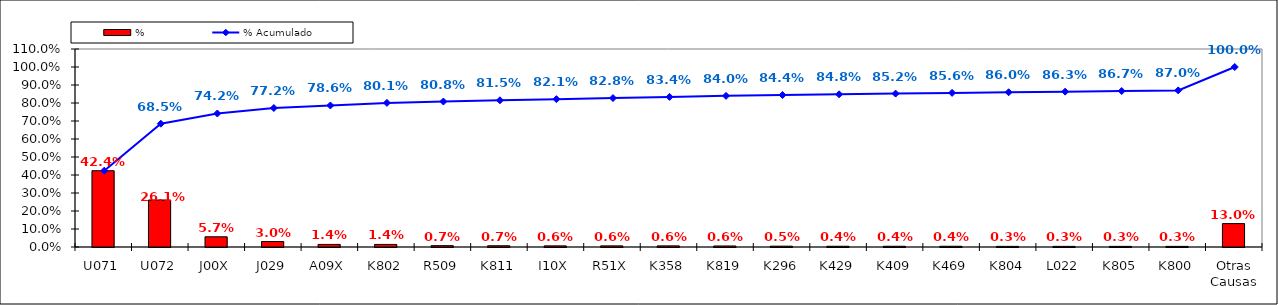
| Category | % |
|---|---|
| U071 | 0.424 |
| U072 | 0.261 |
| J00X | 0.057 |
| J029 | 0.03 |
| A09X | 0.014 |
| K802 | 0.014 |
| R509 | 0.007 |
| K811 | 0.007 |
| I10X | 0.006 |
| R51X | 0.006 |
| K358 | 0.006 |
| K819 | 0.006 |
| K296 | 0.005 |
| K429 | 0.004 |
| K409 | 0.004 |
| K469 | 0.004 |
| K804 | 0.003 |
| L022 | 0.003 |
| K805 | 0.003 |
| K800 | 0.003 |
| Otras Causas | 0.13 |